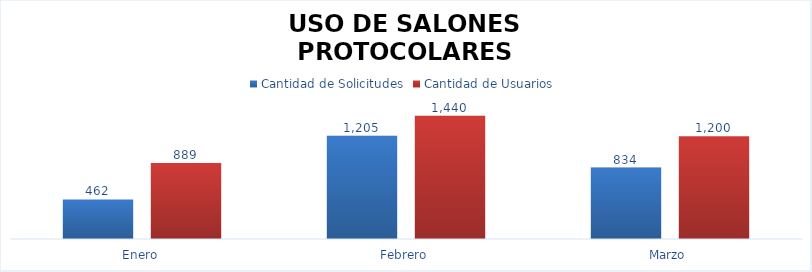
| Category | Cantidad de Solicitudes | Cantidad de Usuarios  |
|---|---|---|
| Enero | 462 | 889 |
| Febrero | 1205 | 1440 |
| Marzo | 834 | 1200 |